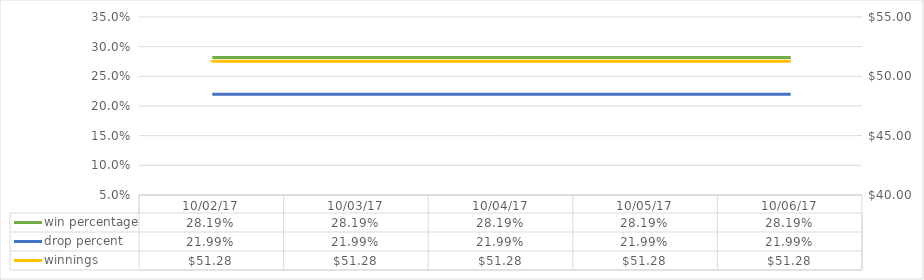
| Category | win percentage | drop percent |
|---|---|---|
| 2017-10-02 | 0.282 | 0.22 |
| 2017-10-03 | 0.282 | 0.22 |
| 2017-10-04 | 0.282 | 0.22 |
| 2017-10-05 | 0.282 | 0.22 |
| 2017-10-06 | 0.282 | 0.22 |